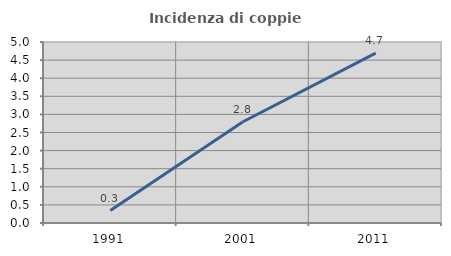
| Category | Incidenza di coppie miste |
|---|---|
| 1991.0 | 0.344 |
| 2001.0 | 2.797 |
| 2011.0 | 4.693 |